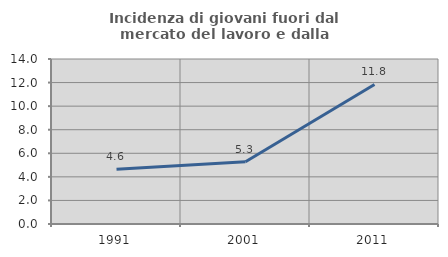
| Category | Incidenza di giovani fuori dal mercato del lavoro e dalla formazione  |
|---|---|
| 1991.0 | 4.636 |
| 2001.0 | 5.288 |
| 2011.0 | 11.842 |